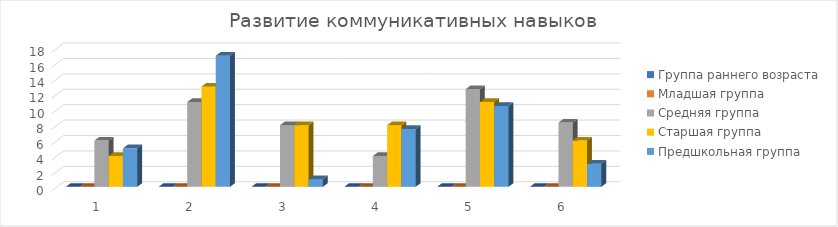
| Category | Группа раннего возраста | Младшая группа | Средняя группа | Старшая группа | Предшкольная группа |
|---|---|---|---|---|---|
| 0 | 0 | 0 | 6 | 4 | 5 |
| 1 | 0 | 0 | 11 | 13 | 17 |
| 2 | 0 | 0 | 8 | 8 | 1 |
| 3 | 0 | 0 | 4 | 8 | 7.5 |
| 4 | 0 | 0 | 12.667 | 11 | 10.5 |
| 5 | 0 | 0 | 8.333 | 6 | 3 |